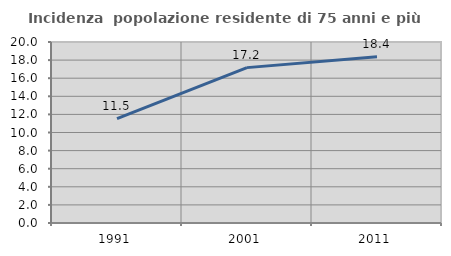
| Category | Incidenza  popolazione residente di 75 anni e più |
|---|---|
| 1991.0 | 11.536 |
| 2001.0 | 17.169 |
| 2011.0 | 18.369 |